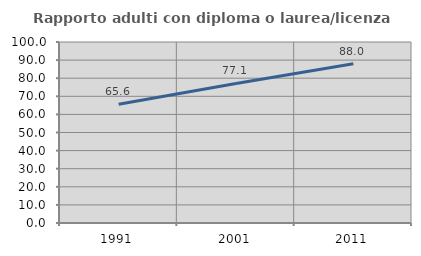
| Category | Rapporto adulti con diploma o laurea/licenza media  |
|---|---|
| 1991.0 | 65.584 |
| 2001.0 | 77.093 |
| 2011.0 | 87.986 |